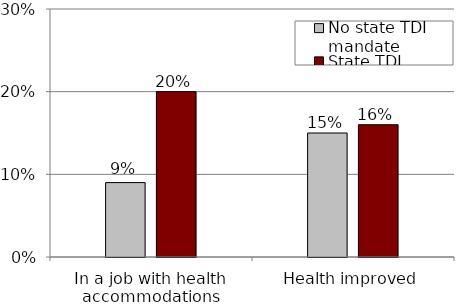
| Category | No state TDI mandate | State TDI mandate |
|---|---|---|
| In a job with health accommodations | 0.09 | 0.2 |
| Health improved | 0.15 | 0.16 |